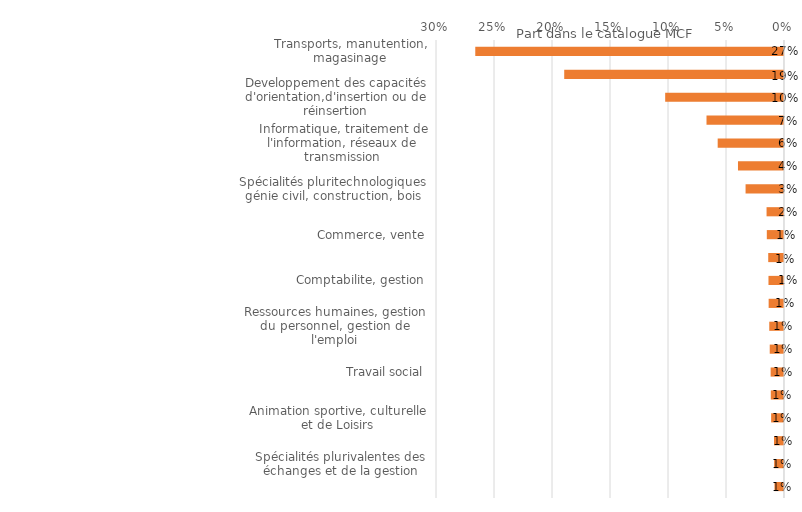
| Category | Series 0 |
|---|---|
| Transports, manutention, magasinage | 0.266 |
| Langues vivantes, civilisations étrangères et régionales | 0.189 |
| Developpement des capacités d'orientation,d'insertion ou de réinsertion | 0.102 |
| Secrétariat, bureautique | 0.067 |
| Informatique, traitement de l'information, réseaux de transmission | 0.057 |
| Sécurite des biens et des personnes, police, surveillance | 0.04 |
| Spécialités pluritechnologiques génie civil, construction, bois | 0.033 |
| Enseignement, formation | 0.015 |
| Commerce, vente | 0.015 |
| Coiffure, esthétique et autres spécialites de services aux personnes | 0.014 |
| Comptabilite, gestion | 0.013 |
| Agro-alimentaire, alimentation, cuisine | 0.013 |
| Ressources humaines, gestion du personnel, gestion de l'emploi | 0.013 |
| Techniques de l'imprimerie et de l'édition | 0.012 |
| Travail social | 0.012 |
| Mécanique générale et de précision, usinage | 0.011 |
| Animation sportive, culturelle et de Loisirs | 0.011 |
| Spécialites plurivalentes de la communication et de l'information | 0.009 |
| Spécialités plurivalentes des échanges et de la gestion | 0.009 |
| Santé | 0.008 |